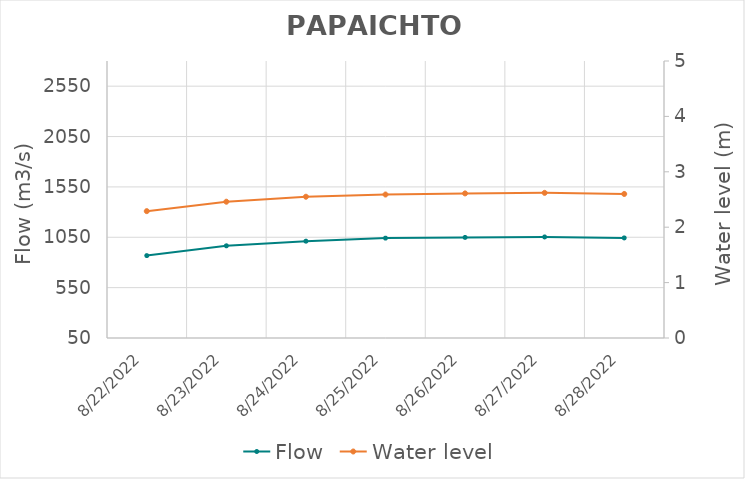
| Category | Flow |
|---|---|
| 4/26/22 | 2520 |
| 4/25/22 | 2444.07 |
| 4/24/22 | 2357.18 |
| 4/23/22 | 2261.72 |
| 4/22/22 | 2173.01 |
| 4/21/22 | 2087.87 |
| 4/20/22 | 2103.22 |